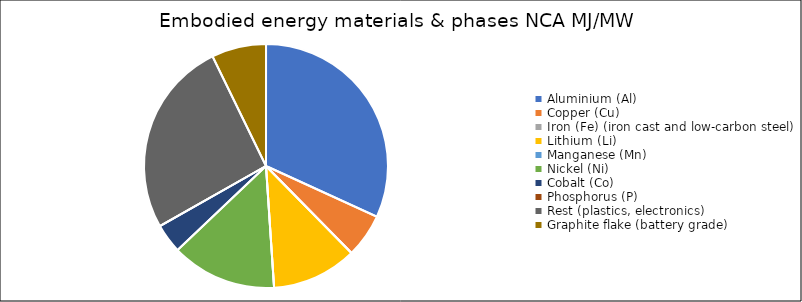
| Category | Embodied energy materials & phases NCA |
|---|---|
| Aluminium (Al) | 126796.268 |
| Copper (Cu) | 23147.685 |
| Iron (Fe) (iron cast and low-carbon steel) | 0 |
| Lithium (Li) | 45038.4 |
| Manganese (Mn) | 0 |
| Nickel (Ni) | 55597.806 |
| Cobalt (Co) | 15537.06 |
| Phosphorus (P) | 0 |
| Rest (plastics, electronics) | 103497.24 |
| Graphite flake (battery grade) | 28798 |